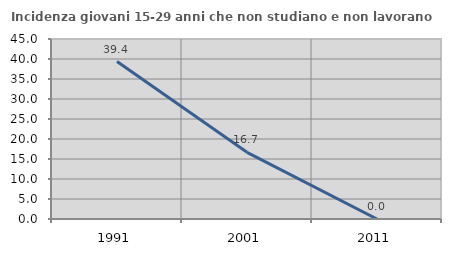
| Category | Incidenza giovani 15-29 anni che non studiano e non lavorano  |
|---|---|
| 1991.0 | 39.362 |
| 2001.0 | 16.667 |
| 2011.0 | 0 |